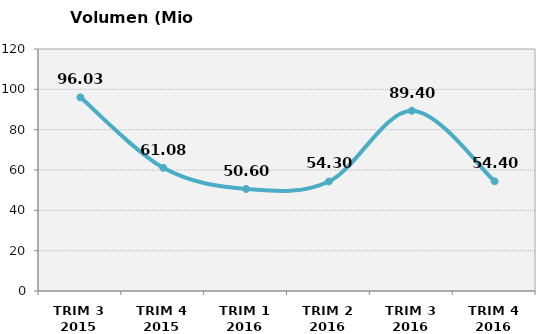
| Category | Volumen (Mio consumiciones) |
|---|---|
| TRIM 3 2015 | 96.032 |
| TRIM 4 2015 | 61.077 |
| TRIM 1 2016 | 50.6 |
| TRIM 2 2016 | 54.3 |
| TRIM 3 2016 | 89.4 |
| TRIM 4 2016 | 54.4 |